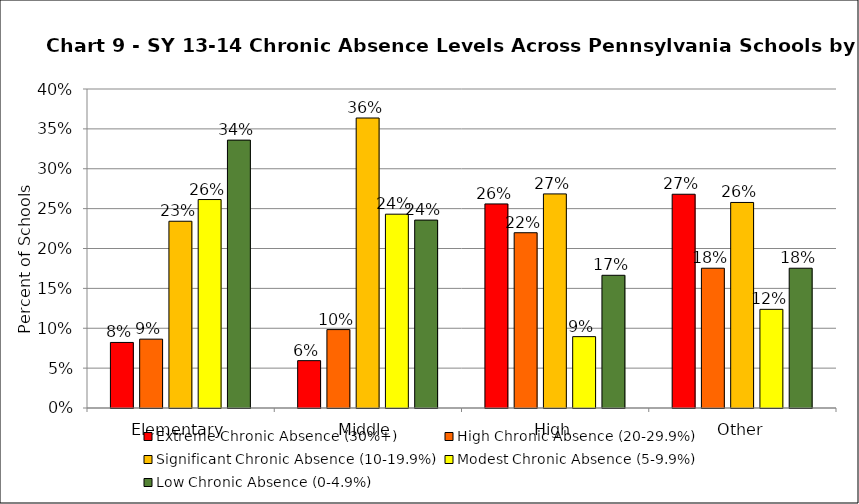
| Category | Extreme Chronic Absence (30%+) | High Chronic Absence (20-29.9%) | Significant Chronic Absence (10-19.9%) | Modest Chronic Absence (5-9.9%) | Low Chronic Absence (0-4.9%) |
|---|---|---|---|---|---|
| 0 | 0.082 | 0.086 | 0.234 | 0.261 | 0.336 |
| 1 | 0.059 | 0.098 | 0.364 | 0.243 | 0.236 |
| 2 | 0.256 | 0.22 | 0.268 | 0.089 | 0.166 |
| 3 | 0.268 | 0.175 | 0.258 | 0.124 | 0.175 |